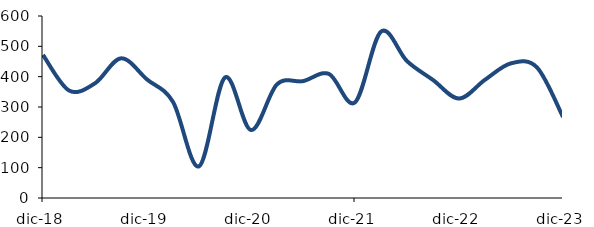
| Category | Series 0 |
|---|---|
| 2018-12-01 | 471.736 |
| 2019-03-01 | 354.449 |
| 2019-06-01 | 378.102 |
| 2019-09-01 | 460.44 |
| 2019-12-01 | 390.826 |
| 2020-03-01 | 316.807 |
| 2020-06-01 | 104.288 |
| 2020-09-01 | 397.493 |
| 2020-12-01 | 223.94 |
| 2021-03-01 | 374.798 |
| 2021-06-01 | 385.213 |
| 2021-09-01 | 408.944 |
| 2021-12-01 | 315.314 |
| 2022-03-01 | 548.435 |
| 2022-06-01 | 451.274 |
| 2022-09-01 | 389.103 |
| 2022-12-01 | 327.913 |
| 2023-03-01 | 389.791 |
| 2023-06-01 | 443.963 |
| 2023-09-01 | 430.429 |
| 2023-12-01 | 267.254 |